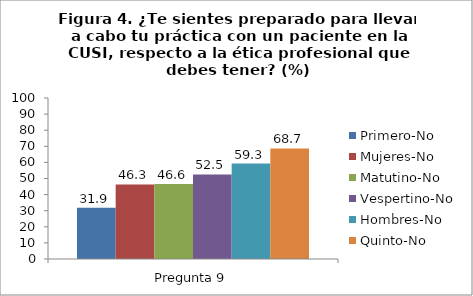
| Category | Primero-No | Mujeres-No | Matutino-No | Vespertino-No | Hombres-No | Quinto-No |
|---|---|---|---|---|---|---|
| 0 | 31.9 | 46.3 | 46.6 | 52.5 | 59.3 | 68.7 |